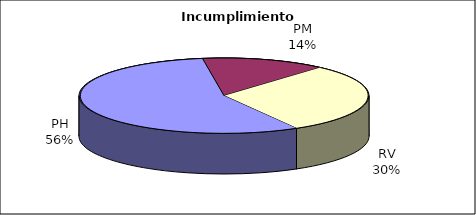
| Category | Valores |
|---|---|
| PH | 277 |
| PM | 69 |
| RV | 149 |